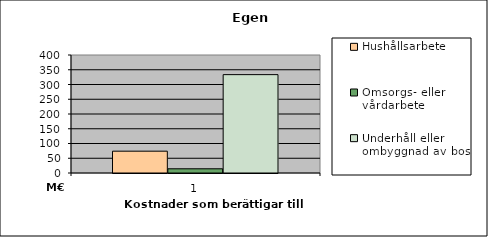
| Category | Hushållsarbete | Omsorgs- eller vårdarbete | Underhåll eller ombyggnad av bostad |
|---|---|---|---|
| 0 | 73952274.72 | 14277607.24 | 333445086.1 |